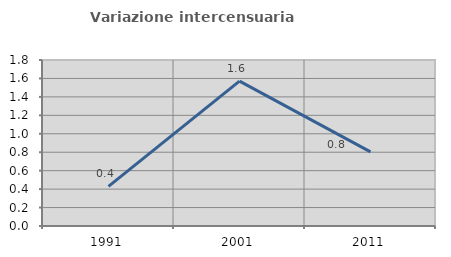
| Category | Variazione intercensuaria annua |
|---|---|
| 1991.0 | 0.43 |
| 2001.0 | 1.571 |
| 2011.0 | 0.804 |